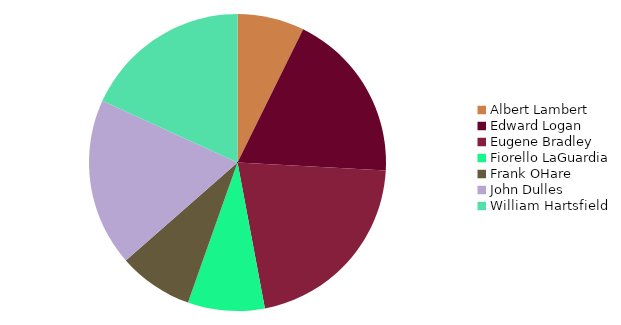
| Category | pie |
|---|---|
| Albert Lambert | 950 |
| Edward Logan | 2420 |
| Eugene Bradley | 2760 |
| Fiorello LaGuardia | 1090 |
| Frank OHare | 1060 |
| John Dulles | 2380 |
| William Hartsfield | 2370 |